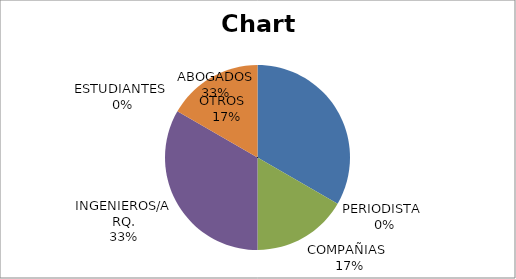
| Category | Series 0 |
|---|---|
| ABOGADOS | 2 |
| PERIODISTA  | 0 |
| COMPAÑIAS  | 1 |
| INGENIEROS/ARQ. | 2 |
| ESTUDIANTES  | 0 |
| OTROS   | 1 |